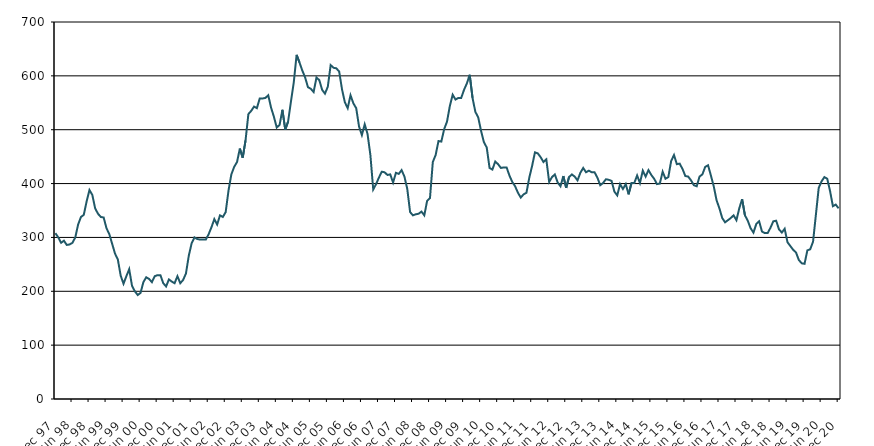
| Category | Series 0 |
|---|---|
| 1997-12-01 | 308 |
| 1998-01-01 | 300 |
| 1998-02-01 | 290 |
| 1998-03-01 | 294 |
| 1998-04-01 | 286 |
| 1998-05-01 | 287 |
| 1998-06-01 | 290 |
| 1998-07-01 | 300 |
| 1998-08-01 | 324 |
| 1998-09-01 | 338 |
| 1998-10-01 | 342 |
| 1998-11-01 | 367 |
| 1998-12-01 | 388 |
| 1999-01-01 | 379 |
| 1999-02-01 | 354 |
| 1999-03-01 | 344 |
| 1999-04-01 | 338 |
| 1999-05-01 | 337 |
| 1999-06-01 | 317 |
| 1999-07-01 | 306 |
| 1999-08-01 | 288 |
| 1999-09-01 | 270 |
| 1999-10-01 | 259 |
| 1999-11-01 | 229 |
| 1999-12-01 | 214 |
| 2000-01-01 | 228 |
| 2000-02-01 | 241 |
| 2000-03-01 | 210 |
| 2000-04-01 | 200 |
| 2000-05-01 | 193 |
| 2000-06-01 | 197 |
| 2000-07-01 | 217 |
| 2000-08-01 | 226 |
| 2000-09-01 | 223 |
| 2000-10-01 | 217 |
| 2000-11-01 | 228 |
| 2000-12-01 | 230 |
| 2001-01-01 | 230 |
| 2001-02-01 | 215 |
| 2001-03-01 | 209 |
| 2001-04-01 | 222 |
| 2001-05-01 | 218 |
| 2001-06-01 | 215 |
| 2001-07-01 | 228 |
| 2001-08-01 | 215 |
| 2001-09-01 | 221 |
| 2001-10-01 | 233 |
| 2001-11-01 | 266 |
| 2001-12-01 | 289 |
| 2002-01-01 | 300 |
| 2002-02-01 | 297 |
| 2002-03-01 | 296 |
| 2002-04-01 | 296 |
| 2002-05-01 | 296 |
| 2002-06-01 | 306 |
| 2002-07-01 | 319 |
| 2002-08-01 | 334 |
| 2002-09-01 | 324 |
| 2002-10-01 | 341 |
| 2002-11-01 | 338 |
| 2002-12-01 | 347 |
| 2003-01-01 | 387 |
| 2003-02-01 | 417 |
| 2003-03-01 | 431 |
| 2003-04-01 | 440 |
| 2003-05-01 | 465 |
| 2003-06-01 | 448 |
| 2003-07-01 | 480 |
| 2003-08-01 | 529 |
| 2003-09-01 | 535 |
| 2003-10-01 | 543 |
| 2003-11-01 | 540 |
| 2003-12-01 | 558 |
| 2004-01-01 | 558 |
| 2004-02-01 | 559 |
| 2004-03-01 | 564 |
| 2004-04-01 | 541 |
| 2004-05-01 | 524 |
| 2004-06-01 | 504 |
| 2004-07-01 | 509 |
| 2004-08-01 | 537 |
| 2004-09-01 | 500 |
| 2004-10-01 | 515 |
| 2004-11-01 | 552 |
| 2004-12-01 | 588 |
| 2005-01-01 | 639 |
| 2005-02-01 | 625 |
| 2005-03-01 | 610 |
| 2005-04-01 | 597 |
| 2005-05-01 | 579 |
| 2005-06-01 | 576 |
| 2005-07-01 | 570 |
| 2005-08-01 | 597 |
| 2005-09-01 | 592 |
| 2005-10-01 | 574 |
| 2005-11-01 | 567 |
| 2005-12-01 | 580 |
| 2006-01-01 | 620 |
| 2006-02-01 | 615 |
| 2006-03-01 | 614 |
| 2006-04-01 | 608 |
| 2006-05-01 | 575 |
| 2006-06-01 | 551 |
| 2006-07-01 | 540 |
| 2006-08-01 | 564 |
| 2006-09-01 | 549 |
| 2006-10-01 | 540 |
| 2006-11-01 | 506 |
| 2006-12-01 | 490 |
| 2007-01-01 | 510 |
| 2007-02-01 | 492 |
| 2007-03-01 | 453 |
| 2007-04-01 | 389 |
| 2007-05-01 | 399 |
| 2007-06-01 | 411 |
| 2007-07-01 | 422 |
| 2007-08-01 | 421 |
| 2007-09-01 | 416 |
| 2007-10-01 | 417 |
| 2007-11-01 | 402 |
| 2007-12-01 | 420 |
| 2008-01-01 | 418 |
| 2008-02-01 | 425 |
| 2008-03-01 | 413 |
| 2008-04-01 | 390 |
| 2008-05-01 | 347 |
| 2008-06-01 | 341 |
| 2008-07-01 | 343 |
| 2008-08-01 | 344 |
| 2008-09-01 | 348 |
| 2008-10-01 | 341 |
| 2008-11-01 | 368 |
| 2008-12-01 | 373 |
| 2009-01-01 | 440 |
| 2009-02-01 | 453 |
| 2009-03-01 | 479 |
| 2009-04-01 | 478 |
| 2009-05-01 | 501 |
| 2009-06-01 | 515 |
| 2009-07-01 | 544 |
| 2009-08-01 | 565 |
| 2009-09-01 | 556 |
| 2009-10-01 | 559 |
| 2009-11-01 | 559 |
| 2009-12-01 | 574 |
| 2010-01-01 | 586 |
| 2010-02-01 | 602 |
| 2010-03-01 | 559 |
| 2010-04-01 | 533 |
| 2010-05-01 | 523 |
| 2010-06-01 | 498 |
| 2010-07-01 | 477 |
| 2010-08-01 | 467 |
| 2010-09-01 | 429 |
| 2010-10-01 | 426 |
| 2010-11-01 | 441 |
| 2010-12-01 | 436 |
| 2011-01-01 | 429 |
| 2011-02-01 | 430 |
| 2011-03-01 | 430 |
| 2011-04-01 | 415 |
| 2011-05-01 | 403 |
| 2011-06-01 | 395 |
| 2011-07-01 | 383 |
| 2011-08-01 | 374 |
| 2011-09-01 | 380 |
| 2011-10-01 | 383 |
| 2011-11-01 | 411 |
| 2011-12-01 | 433 |
| 2012-01-01 | 458 |
| 2012-02-01 | 456 |
| 2012-03-01 | 449 |
| 2012-04-01 | 440 |
| 2012-05-01 | 445 |
| 2012-06-01 | 403 |
| 2012-07-01 | 412 |
| 2012-08-01 | 417 |
| 2012-09-01 | 402 |
| 2012-10-01 | 395 |
| 2012-11-01 | 414 |
| 2012-12-01 | 392 |
| 2013-01-01 | 412 |
| 2013-02-01 | 417 |
| 2013-03-01 | 413 |
| 2013-04-01 | 406 |
| 2013-05-01 | 420 |
| 2013-06-01 | 429 |
| 2013-07-01 | 421 |
| 2013-08-01 | 424 |
| 2013-09-01 | 421 |
| 2013-10-01 | 421 |
| 2013-11-01 | 411 |
| 2013-12-01 | 397 |
| 2014-01-01 | 401 |
| 2014-02-01 | 408 |
| 2014-03-01 | 407 |
| 2014-04-01 | 405 |
| 2014-05-01 | 385 |
| 2014-06-01 | 378 |
| 2014-07-01 | 399 |
| 2014-08-01 | 390 |
| 2014-09-01 | 399 |
| 2014-10-01 | 380 |
| 2014-11-01 | 401 |
| 2014-12-01 | 401 |
| 2015-01-01 | 415 |
| 2015-02-01 | 401 |
| 2015-03-01 | 424 |
| 2015-04-01 | 413 |
| 2015-05-01 | 425 |
| 2015-06-01 | 416 |
| 2015-07-01 | 409 |
| 2015-08-01 | 399 |
| 2015-09-01 | 400 |
| 2015-10-01 | 422 |
| 2015-11-01 | 409 |
| 2015-12-01 | 412 |
| 2016-01-01 | 442 |
| 2016-02-01 | 453 |
| 2016-03-01 | 436 |
| 2016-04-01 | 437 |
| 2016-05-01 | 427 |
| 2016-06-01 | 414 |
| 2016-07-01 | 413 |
| 2016-08-01 | 406 |
| 2016-09-01 | 397 |
| 2016-10-01 | 395 |
| 2016-11-01 | 413 |
| 2016-12-01 | 417 |
| 2017-01-01 | 431 |
| 2017-02-01 | 434 |
| 2017-03-01 | 415 |
| 2017-04-01 | 395 |
| 2017-05-01 | 369 |
| 2017-06-01 | 354 |
| 2017-07-01 | 336 |
| 2017-08-01 | 328 |
| 2017-09-01 | 332 |
| 2017-10-01 | 336 |
| 2017-11-01 | 341 |
| 2017-12-01 | 332 |
| 2018-01-01 | 354 |
| 2018-02-01 | 371 |
| 2018-03-01 | 341 |
| 2018-04-01 | 331 |
| 2018-05-01 | 317 |
| 2018-06-01 | 309 |
| 2018-07-01 | 325 |
| 2018-08-01 | 330 |
| 2018-09-01 | 311 |
| 2018-10-01 | 308 |
| 2018-11-01 | 308 |
| 2018-12-01 | 318 |
| 2019-01-01 | 330 |
| 2019-02-01 | 331 |
| 2019-03-01 | 315 |
| 2019-04-01 | 309 |
| 2019-05-01 | 316 |
| 2019-06-01 | 291 |
| 2019-07-01 | 284 |
| 2019-08-01 | 277 |
| 2019-09-01 | 272 |
| 2019-10-01 | 258 |
| 2019-11-01 | 252 |
| 2019-12-01 | 251 |
| 2020-01-01 | 276 |
| 2020-02-01 | 278 |
| 2020-03-01 | 292 |
| 2020-04-01 | 342 |
| 2020-05-01 | 392 |
| 2020-06-01 | 404 |
| 2020-07-01 | 412 |
| 2020-08-01 | 409 |
| 2020-09-01 | 386 |
| 2020-10-01 | 358 |
| 2020-11-01 | 361 |
| 2020-12-01 | 354 |